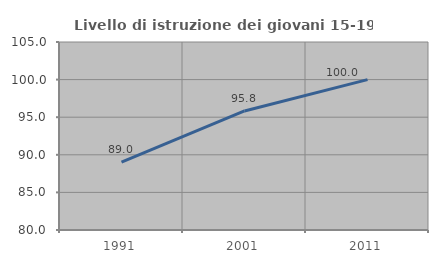
| Category | Livello di istruzione dei giovani 15-19 anni |
|---|---|
| 1991.0 | 89.041 |
| 2001.0 | 95.833 |
| 2011.0 | 100 |